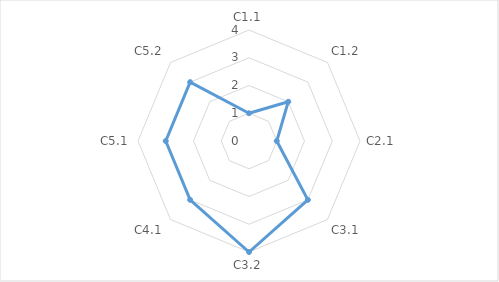
| Category | Series 0 | "" | 1 | 2 | 3 | 4 |
|---|---|---|---|---|---|---|
| C1.1 | 1 |  |  |  |  |  |
| C1.2 | 2 |  |  |  |  |  |
| C2.1 | 1 |  |  |  |  |  |
| C3.1 | 3 |  |  |  |  |  |
| C3.2 | 4 |  |  |  |  |  |
| C4.1 | 3 |  |  |  |  |  |
| C5.1 | 3 |  |  |  |  |  |
| C5.2 | 3 |  |  |  |  |  |